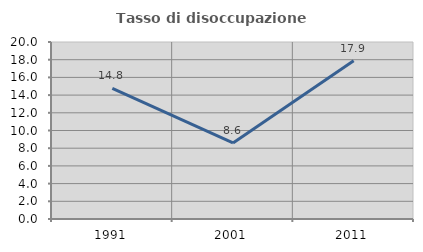
| Category | Tasso di disoccupazione giovanile  |
|---|---|
| 1991.0 | 14.762 |
| 2001.0 | 8.591 |
| 2011.0 | 17.87 |